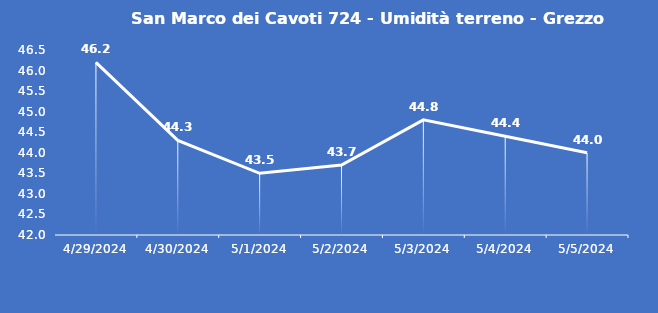
| Category | San Marco dei Cavoti 724 - Umidità terreno - Grezzo (%VWC) |
|---|---|
| 4/29/24 | 46.2 |
| 4/30/24 | 44.3 |
| 5/1/24 | 43.5 |
| 5/2/24 | 43.7 |
| 5/3/24 | 44.8 |
| 5/4/24 | 44.4 |
| 5/5/24 | 44 |